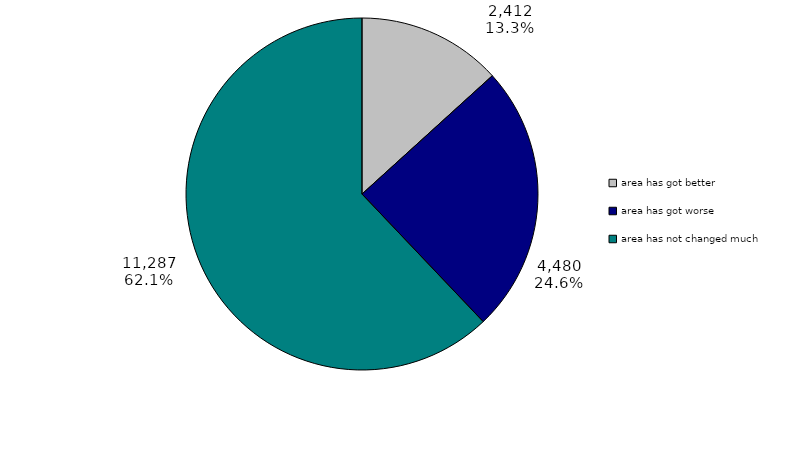
| Category | Series 0 |
|---|---|
| area has got better | 2411.918 |
| area has got worse | 4480.106 |
| area has not changed much | 11287.305 |